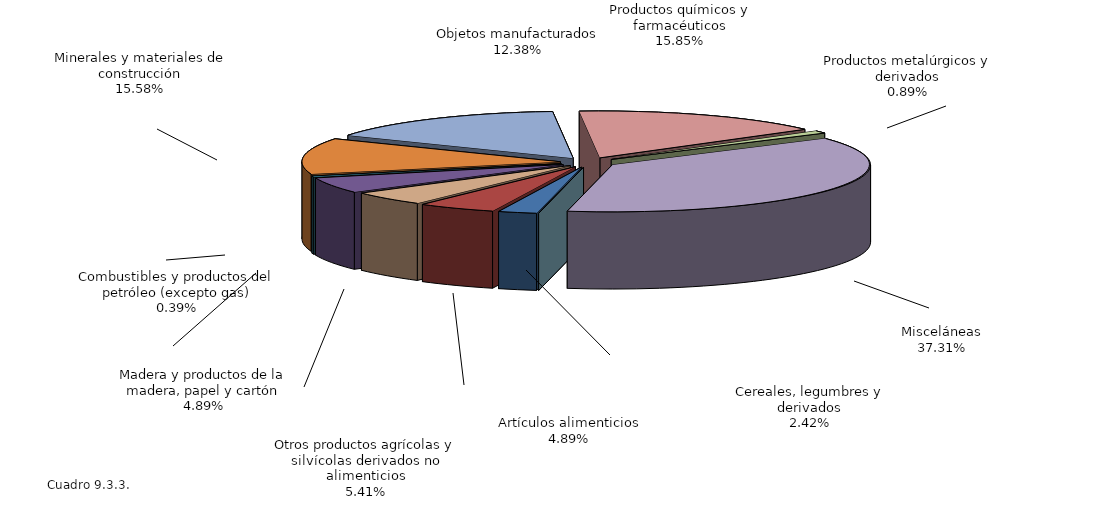
| Category | Series 0 |
|---|---|
| Cereales, legumbres y derivados | 2.416 |
| Madera y productos de la madera, papel y cartón | 4.887 |
| Artículos alimenticios | 4.893 |
| Otros productos agrícolas y silvícolas derivados no alimenticios | 5.406 |
| Combustibles y productos del petróleo (excepto gas) | 0.386 |
| Objetos manufacturados | 12.379 |
| Minerales y materiales de construcción | 15.584 |
| Productos químicos y farmacéuticos | 15.849 |
| Productos metalúrgicos y derivados | 0.888 |
| Misceláneas | 37.313 |